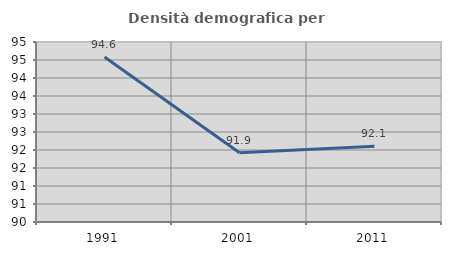
| Category | Densità demografica |
|---|---|
| 1991.0 | 94.582 |
| 2001.0 | 91.923 |
| 2011.0 | 92.104 |